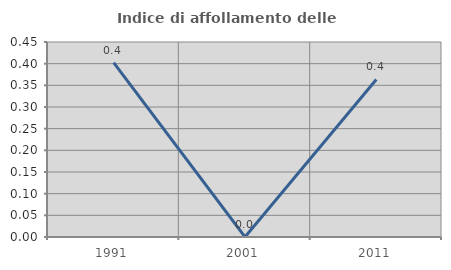
| Category | Indice di affollamento delle abitazioni  |
|---|---|
| 1991.0 | 0.402 |
| 2001.0 | 0 |
| 2011.0 | 0.364 |